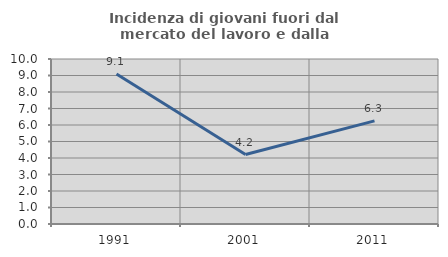
| Category | Incidenza di giovani fuori dal mercato del lavoro e dalla formazione  |
|---|---|
| 1991.0 | 9.091 |
| 2001.0 | 4.211 |
| 2011.0 | 6.25 |